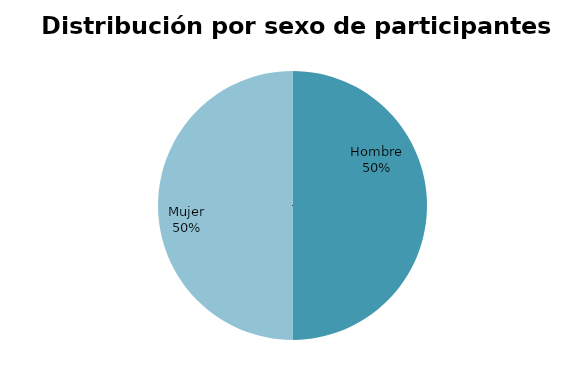
| Category | Series 0 |
|---|---|
| Hombre | 10 |
| Mujer | 10 |